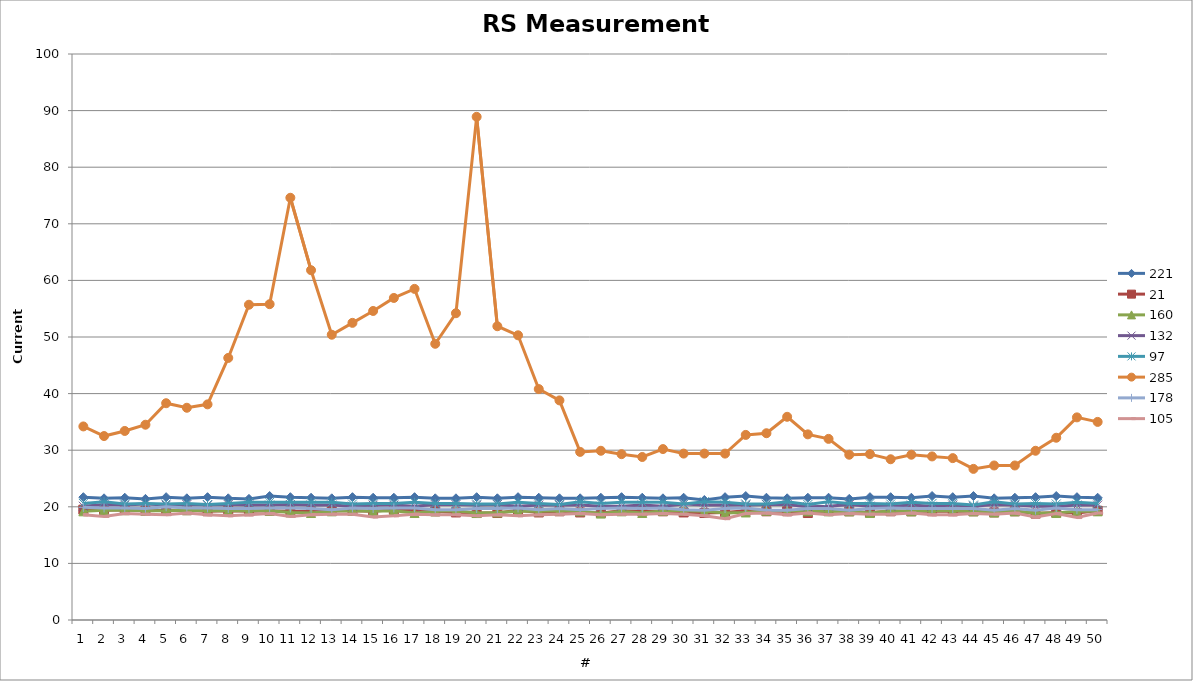
| Category | 221 | 21 | 160 | 132 | 97 | 285 | 178 | 105 |
|---|---|---|---|---|---|---|---|---|
| 0 | 21.7 | 19.5 | 19.2 | 20.1 | 20.6 | 34.2 | 19.9 | 18.6 |
| 1 | 21.5 | 19.4 | 19.4 | 20.4 | 20.9 | 32.5 | 19.8 | 18.3 |
| 2 | 21.6 | 19.5 | 19.4 | 20.3 | 20.5 | 33.4 | 19.8 | 18.8 |
| 3 | 21.4 | 19.3 | 19.3 | 20.5 | 20.6 | 34.5 | 19.7 | 18.7 |
| 4 | 21.7 | 19.4 | 19.3 | 20.3 | 20.5 | 38.3 | 20 | 18.6 |
| 5 | 21.5 | 19.4 | 19.4 | 20.4 | 20.6 | 37.5 | 19.8 | 18.9 |
| 6 | 21.7 | 19.2 | 19.3 | 20.3 | 20.4 | 38.1 | 19.8 | 18.6 |
| 7 | 21.5 | 19.3 | 19.3 | 20.4 | 20.6 | 46.3 | 19.7 | 18.4 |
| 8 | 21.4 | 19.2 | 19.3 | 20.3 | 20.8 | 55.7 | 19.7 | 18.6 |
| 9 | 21.9 | 19.3 | 19.3 | 20.3 | 20.8 | 55.8 | 19.8 | 18.8 |
| 10 | 21.7 | 19.2 | 19 | 20.4 | 20.8 | 74.6 | 19.8 | 18.3 |
| 11 | 21.6 | 19.2 | 18.9 | 20.3 | 20.8 | 61.8 | 19.7 | 18.6 |
| 12 | 21.5 | 19.3 | 19.2 | 20.3 | 20.8 | 50.4 | 19.5 | 18.7 |
| 13 | 21.7 | 19.3 | 19.3 | 20.1 | 20.5 | 52.5 | 19.8 | 18.7 |
| 14 | 21.6 | 19.2 | 19.2 | 20.3 | 20.6 | 54.6 | 19.7 | 18.2 |
| 15 | 21.6 | 19.5 | 19.3 | 20.3 | 20.6 | 56.9 | 19.8 | 18.4 |
| 16 | 21.7 | 19.4 | 18.9 | 20.1 | 20.8 | 58.5 | 19.8 | 18.7 |
| 17 | 21.5 | 19.2 | 19.2 | 20.4 | 20.6 | 48.8 | 19.5 | 18.6 |
| 18 | 21.5 | 19 | 19.3 | 20.4 | 20.6 | 54.2 | 19.5 | 18.6 |
| 19 | 21.7 | 18.9 | 18.9 | 20.3 | 20.5 | 88.9 | 19.7 | 18.4 |
| 20 | 21.5 | 18.9 | 19 | 20.4 | 20.5 | 51.9 | 19.7 | 18.6 |
| 21 | 21.7 | 19.4 | 19.2 | 20.1 | 20.8 | 50.3 | 19.8 | 18.4 |
| 22 | 21.6 | 19 | 19.2 | 20.3 | 20.6 | 40.8 | 19.5 | 18.6 |
| 23 | 21.5 | 19.2 | 19.3 | 20.3 | 20.4 | 38.8 | 19.7 | 18.7 |
| 24 | 21.5 | 19 | 19.2 | 20.3 | 20.9 | 29.7 | 19.5 | 18.8 |
| 25 | 21.6 | 18.9 | 18.8 | 20.1 | 20.6 | 29.9 | 19.7 | 18.6 |
| 26 | 21.7 | 19.3 | 19.2 | 20.1 | 20.8 | 29.3 | 19.8 | 18.7 |
| 27 | 21.6 | 19.2 | 18.9 | 20.3 | 20.8 | 28.8 | 19.7 | 18.7 |
| 28 | 21.5 | 19.2 | 19.3 | 20.1 | 20.8 | 30.2 | 19.8 | 18.8 |
| 29 | 21.6 | 19 | 19.3 | 20.5 | 20.5 | 29.4 | 19.5 | 18.7 |
| 30 | 21.2 | 18.9 | 19.2 | 20.3 | 20.9 | 29.4 | 19.4 | 18.4 |
| 31 | 21.7 | 19 | 18.9 | 20.3 | 20.8 | 29.4 | 19.7 | 17.9 |
| 32 | 21.9 | 19.3 | 19 | 20.3 | 20.5 | 32.7 | 19.8 | 18.8 |
| 33 | 21.6 | 19.2 | 19.3 | 20.4 | 20.5 | 33 | 19.4 | 18.9 |
| 34 | 21.5 | 19.2 | 19.3 | 20.4 | 20.9 | 35.9 | 19.4 | 18.6 |
| 35 | 21.6 | 18.9 | 19.2 | 20 | 20.4 | 32.8 | 19.7 | 18.9 |
| 36 | 21.6 | 19.3 | 19.2 | 20.1 | 20.9 | 32 | 19.7 | 18.6 |
| 37 | 21.4 | 19.2 | 19.2 | 20.4 | 20.6 | 29.2 | 19.4 | 18.8 |
| 38 | 21.7 | 19 | 18.9 | 20.1 | 20.6 | 29.3 | 19.7 | 18.7 |
| 39 | 21.7 | 19.2 | 19.3 | 20.1 | 20.5 | 28.4 | 19.8 | 18.7 |
| 40 | 21.6 | 19.2 | 19.2 | 20.3 | 20.8 | 29.2 | 19.7 | 18.9 |
| 41 | 21.9 | 19.2 | 19.3 | 20.1 | 20.6 | 28.9 | 19.7 | 18.6 |
| 42 | 21.7 | 19.2 | 19.3 | 20.3 | 20.6 | 28.6 | 19.7 | 18.6 |
| 43 | 21.9 | 19.2 | 19.2 | 20.1 | 20.3 | 26.7 | 19.7 | 18.8 |
| 44 | 21.5 | 19 | 19 | 20.4 | 20.9 | 27.3 | 19.4 | 18.7 |
| 45 | 21.6 | 19.2 | 19.2 | 20.3 | 20.5 | 27.3 | 19.7 | 18.9 |
| 46 | 21.7 | 18.8 | 18.9 | 20.1 | 20.6 | 29.9 | 19.4 | 18.2 |
| 47 | 21.9 | 19 | 18.9 | 20.1 | 20.5 | 32.2 | 19.8 | 18.8 |
| 48 | 21.7 | 18.9 | 19.2 | 20.3 | 20.8 | 35.8 | 19.5 | 18.1 |
| 49 | 21.6 | 19.3 | 19.2 | 20.3 | 20.6 | 35 | 19.5 | 18.9 |